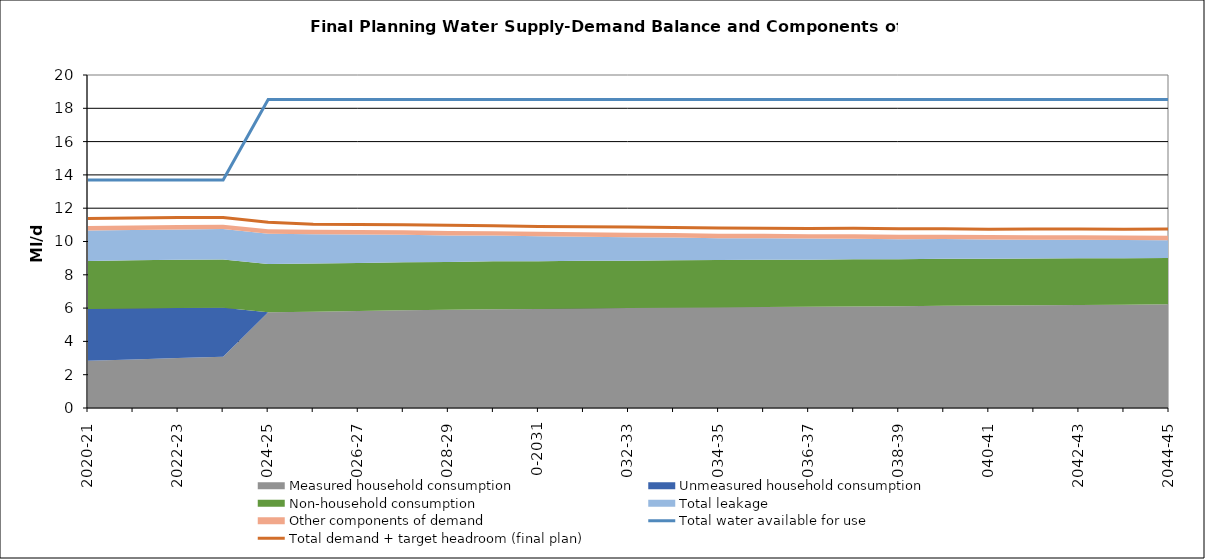
| Category | Total water available for use | Total demand + target headroom (final plan) |
|---|---|---|
| 0 | 13.689 | 11.385 |
| 1 | 13.689 | 11.407 |
| 2 | 13.689 | 11.438 |
| 3 | 13.689 | 11.441 |
| 4 | 18.529 | 11.155 |
| 5 | 18.529 | 11.031 |
| 6 | 18.529 | 11.022 |
| 7 | 18.529 | 11.011 |
| 8 | 18.529 | 10.969 |
| 9 | 18.529 | 10.953 |
| 10 | 18.529 | 10.907 |
| 11 | 18.529 | 10.893 |
| 12 | 18.529 | 10.867 |
| 13 | 18.529 | 10.838 |
| 14 | 18.529 | 10.807 |
| 15 | 18.529 | 10.796 |
| 16 | 18.529 | 10.779 |
| 17 | 18.529 | 10.789 |
| 18 | 18.529 | 10.767 |
| 19 | 18.529 | 10.768 |
| 20 | 18.529 | 10.741 |
| 21 | 18.529 | 10.748 |
| 22 | 18.529 | 10.755 |
| 23 | 18.529 | 10.731 |
| 24 | 18.529 | 10.744 |